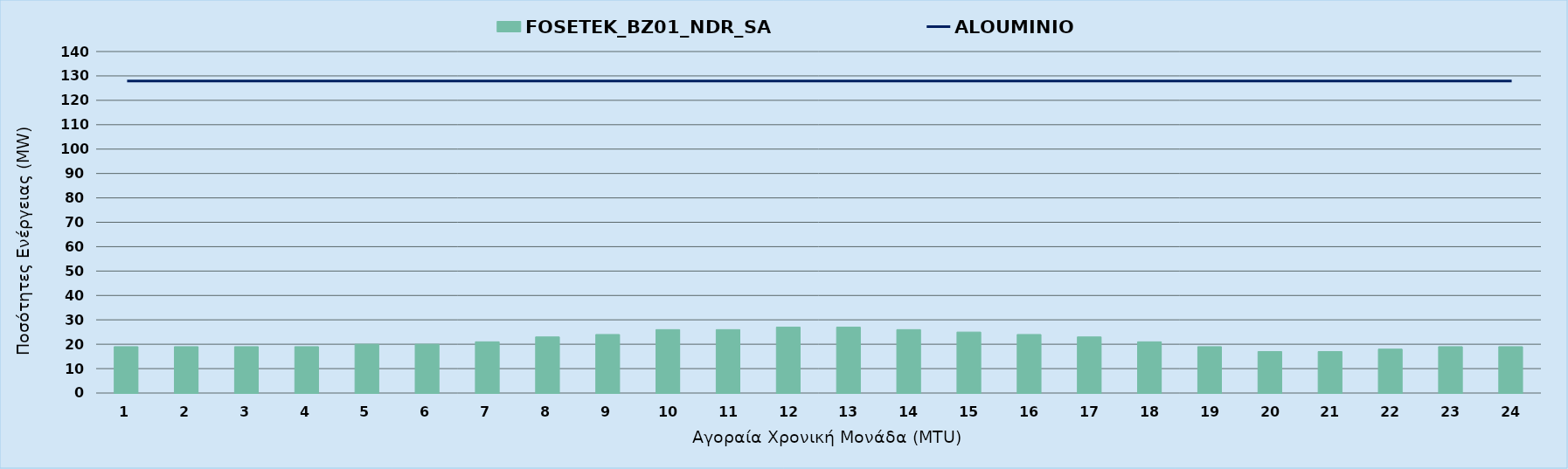
| Category | FOSETEK_BZ01_NDR_SA |
|---|---|
| 0 | 19 |
| 1 | 19 |
| 2 | 19 |
| 3 | 19 |
| 4 | 20 |
| 5 | 20 |
| 6 | 21 |
| 7 | 23 |
| 8 | 24 |
| 9 | 26 |
| 10 | 26 |
| 11 | 27 |
| 12 | 27 |
| 13 | 26 |
| 14 | 25 |
| 15 | 24 |
| 16 | 23 |
| 17 | 21 |
| 18 | 19 |
| 19 | 17 |
| 20 | 17 |
| 21 | 18 |
| 22 | 19 |
| 23 | 19 |